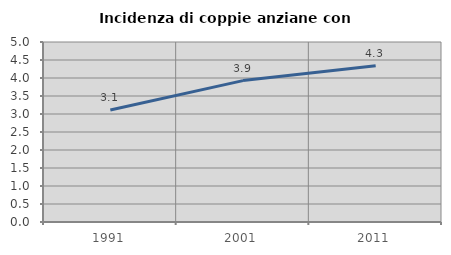
| Category | Incidenza di coppie anziane con figli |
|---|---|
| 1991.0 | 3.11 |
| 2001.0 | 3.927 |
| 2011.0 | 4.339 |